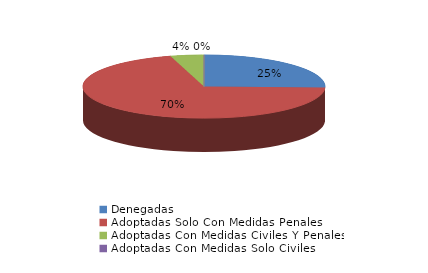
| Category | Series 0 |
|---|---|
| Denegadas | 40 |
| Adoptadas Solo Con Medidas Penales | 110 |
| Adoptadas Con Medidas Civiles Y Penales | 7 |
| Adoptadas Con Medidas Solo Civiles | 0 |